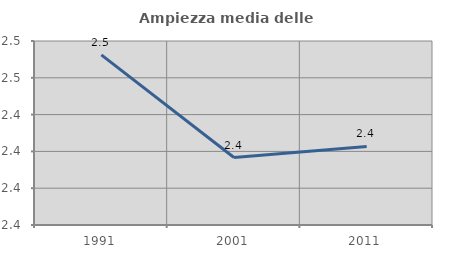
| Category | Ampiezza media delle famiglie |
|---|---|
| 1991.0 | 2.472 |
| 2001.0 | 2.417 |
| 2011.0 | 2.423 |